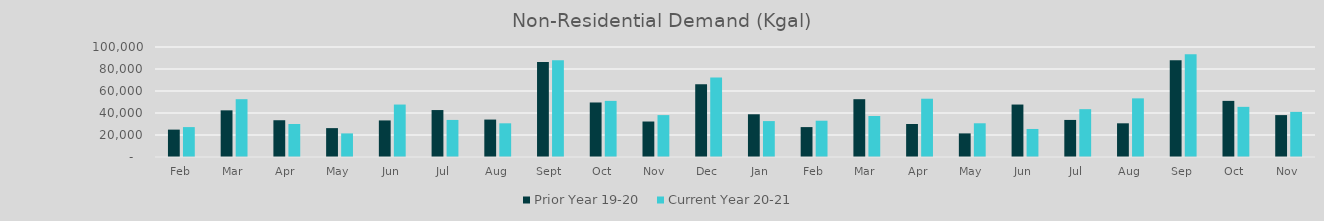
| Category | Prior Year 19-20  | Current Year 20-21 |
|---|---|---|
| Feb | 24891.705 | 27184.287 |
| Mar | 42416.796 | 52556.784 |
| Apr | 33427.881 | 30008.586 |
| May | 26254.448 | 21459.484 |
| Jun | 33248.873 | 47687.401 |
| Jul | 42679.938 | 33702.696 |
| Aug | 34036.498 | 30630.765 |
| Sep | 86367.775 | 87939.966 |
| Oct | 49561.754 | 51017.647 |
| Nov | 32261.42 | 38090.247 |
| Dec | 66164.871 | 72201.815 |
| Jan | 38851.995 | 32645.301 |
| Feb | 27184.287 | 32987.653 |
| Mar | 52556.784 | 37296.185 |
| Apr | 30008.586 | 52983.593 |
| May | 21459.484 | 30657.737 |
| Jun | 47687.401 | 25485.258 |
| Jul | 33702.696 | 43493.567 |
| Aug | 30630.765 | 53305.831 |
| Sep | 87939.966 | 93442.494 |
| Oct | 51017.647 | 45586.98 |
| Nov | 38090.247 | 41019.482 |